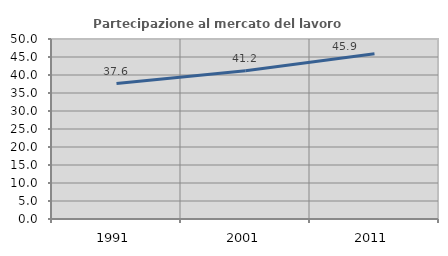
| Category | Partecipazione al mercato del lavoro  femminile |
|---|---|
| 1991.0 | 37.609 |
| 2001.0 | 41.174 |
| 2011.0 | 45.874 |